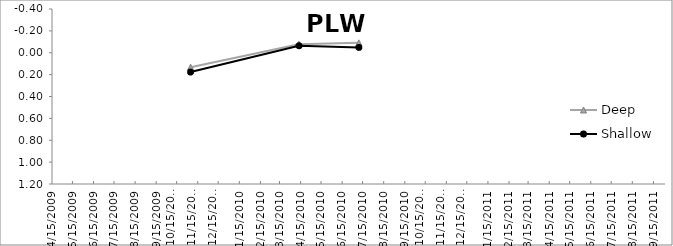
| Category | Deep | Shallow |
|---|---|---|
| 11/4/09 | 0.132 | 0.177 |
| 4/12/10 | -0.078 | -0.064 |
| 7/9/10 | -0.091 | -0.049 |